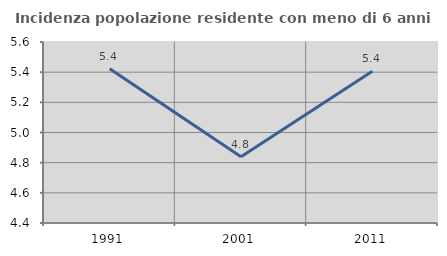
| Category | Incidenza popolazione residente con meno di 6 anni |
|---|---|
| 1991.0 | 5.423 |
| 2001.0 | 4.84 |
| 2011.0 | 5.405 |